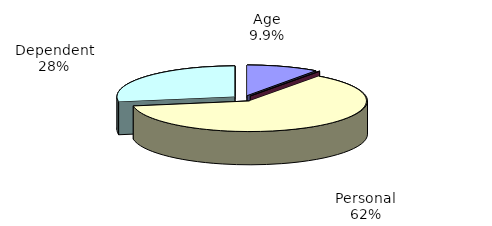
| Category | Series 0 |
|---|---|
| Age | 848604 |
| Blindness | 8944 |
| Personal | 5346577 |
| Dependent | 2367040 |